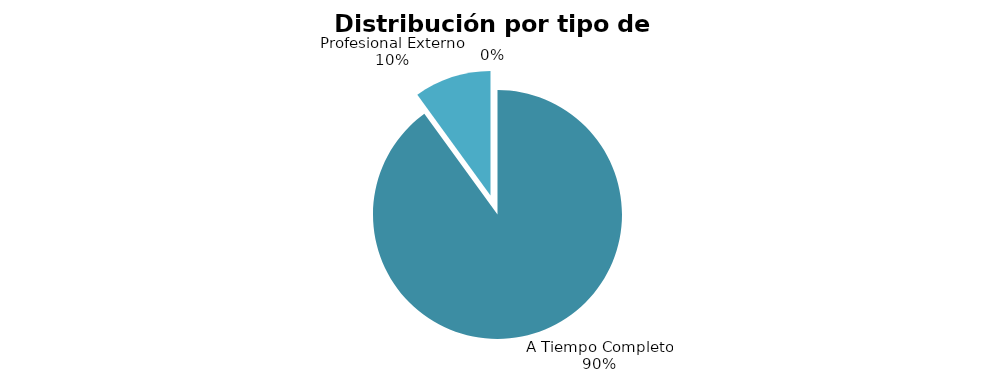
| Category | 9 |
|---|---|
| A Tiempo Completo | 9 |
| Profesional Externo | 1 |